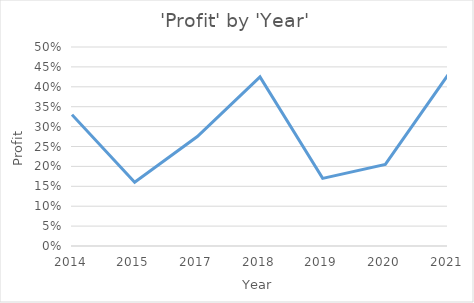
| Category | Total |
|---|---|
| 2014 | 0.33 |
| 2015 | 0.16 |
| 2017 | 0.275 |
| 2018 | 0.425 |
| 2019 | 0.17 |
| 2020 | 0.205 |
| 2021 | 0.43 |